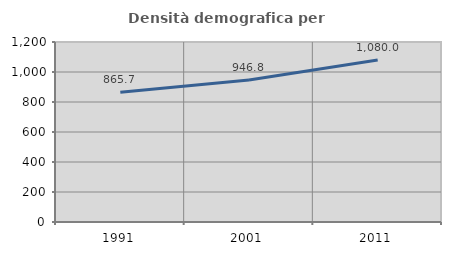
| Category | Densità demografica |
|---|---|
| 1991.0 | 865.677 |
| 2001.0 | 946.793 |
| 2011.0 | 1080.048 |